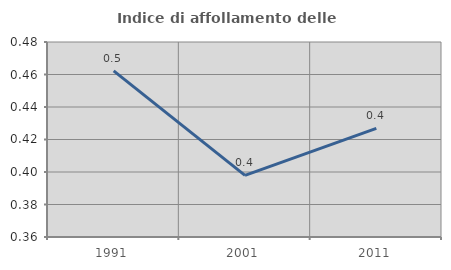
| Category | Indice di affollamento delle abitazioni  |
|---|---|
| 1991.0 | 0.462 |
| 2001.0 | 0.398 |
| 2011.0 | 0.427 |